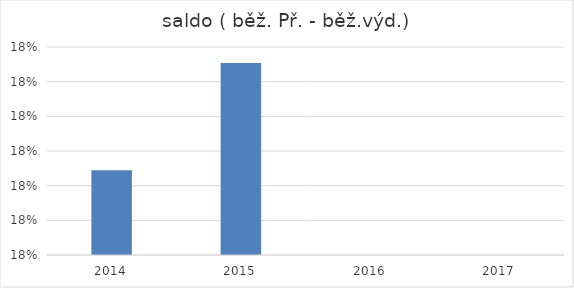
| Category | saldo ( běž. Př. - běž.výd.) |
|---|---|
| 2014.0 | 0.179 |
| 2015.0 | 0.183 |
| 2016.0 | 0 |
| 2017.0 | 0 |